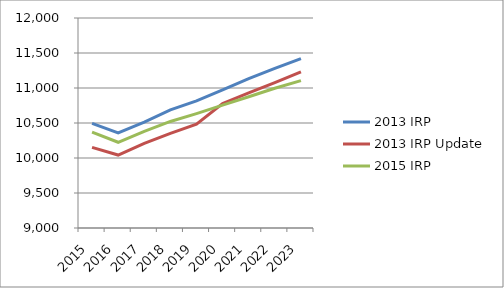
| Category | 2013 IRP | 2013 IRP Update | 2015 IRP |
|---|---|---|---|
| 2015.0 | 10494.438 | 10152.159 | 10368.343 |
| 2016.0 | 10358.752 | 10041.983 | 10224.701 |
| 2017.0 | 10512.796 | 10209.911 | 10381.458 |
| 2018.0 | 10687.093 | 10352.387 | 10522.107 |
| 2019.0 | 10815.406 | 10482.552 | 10634.546 |
| 2020.0 | 10971.77 | 10776.858 | 10754.966 |
| 2021.0 | 11132.532 | 10928.807 | 10875.659 |
| 2022.0 | 11279.984 | 11075.979 | 10995.747 |
| 2023.0 | 11420.716 | 11231.966 | 11105.431 |